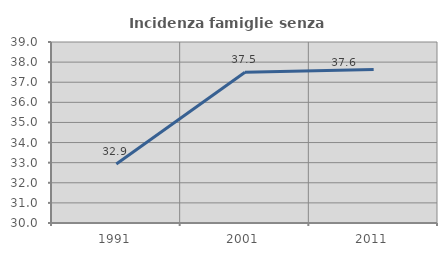
| Category | Incidenza famiglie senza nuclei |
|---|---|
| 1991.0 | 32.934 |
| 2001.0 | 37.5 |
| 2011.0 | 37.629 |